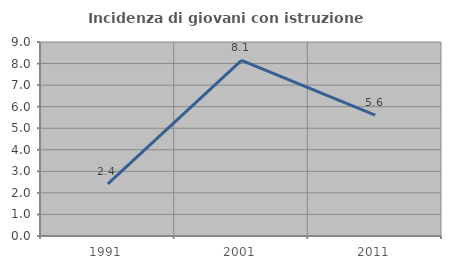
| Category | Incidenza di giovani con istruzione universitaria |
|---|---|
| 1991.0 | 2.419 |
| 2001.0 | 8.148 |
| 2011.0 | 5.607 |